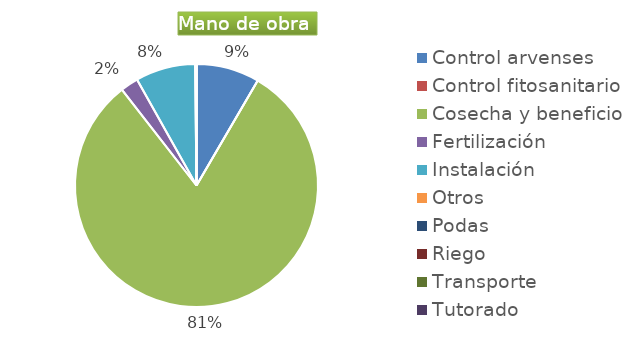
| Category | Series 0 |
|---|---|
| Control arvenses | 11300000 |
| Control fitosanitario | 0 |
| Cosecha y beneficio | 108960552 |
| Fertilización | 3200000 |
| Instalación | 10700000 |
| Otros | 250000 |
| Podas | 0 |
| Riego | 0 |
| Transporte | 0 |
| Tutorado | 0 |